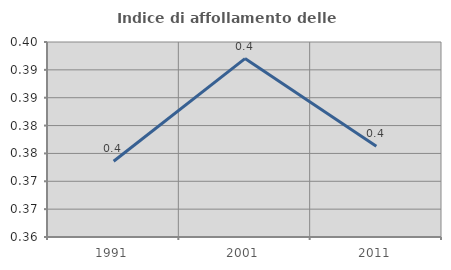
| Category | Indice di affollamento delle abitazioni  |
|---|---|
| 1991.0 | 0.374 |
| 2001.0 | 0.392 |
| 2011.0 | 0.376 |